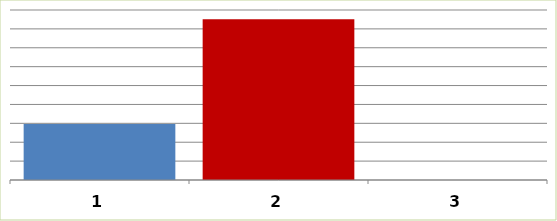
| Category | Series 0 |
|---|---|
| 0 | 14836498.5 |
| 1 | 42525001 |
| 2 | 0 |